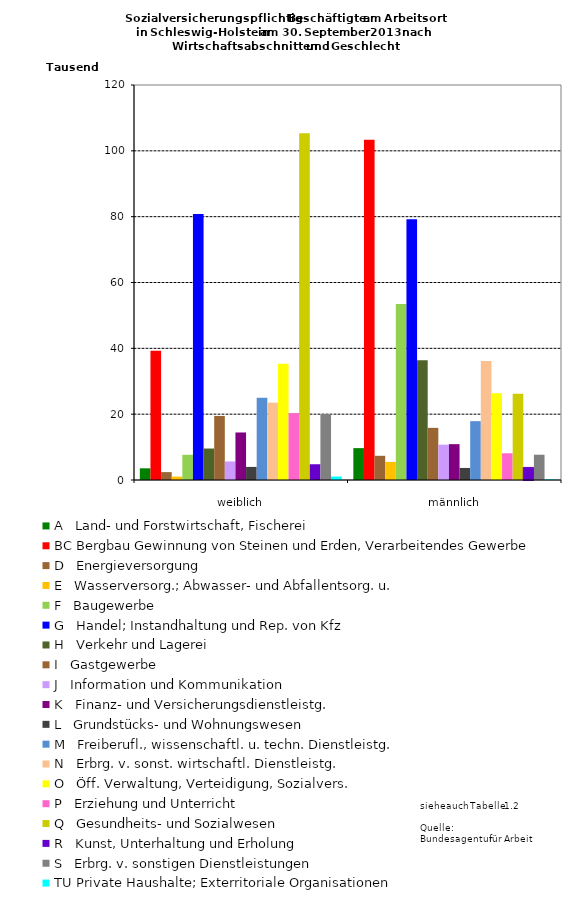
| Category | A   Land- und Forstwirtschaft, Fischerei | BC Bergbau Gewinnung von Steinen und Erden, Verarbeitendes Gewerbe | D   Energieversorgung | E   Wasserversorg.; Abwasser- und Abfallentsorg. u. | F   Baugewerbe | G   Handel; Instandhaltung und Rep. von Kfz | H   Verkehr und Lagerei | I   Gastgewerbe | J   Information und Kommunikation | K   Finanz- und Versicherungsdienstleistg. | L   Grundstücks- und Wohnungswesen | M   Freiberufl., wissenschaftl. u. techn. Dienstleistg. | N   Erbrg. v. sonst. wirtschaftl. Dienstleistg. | O   Öff. Verwaltung, Verteidigung, Sozialvers. | P   Erziehung und Unterricht | Q   Gesundheits- und Sozialwesen | R   Kunst, Unterhaltung und Erholung | S   Erbrg. v. sonstigen Dienstleistungen | TU Private Haushalte; Exterritoriale Organisationen |
|---|---|---|---|---|---|---|---|---|---|---|---|---|---|---|---|---|---|---|---|
| weiblich | 3550 | 39253 | 2395 | 1038 | 7664 | 80775 | 9560 | 19460 | 5640 | 14436 | 3978 | 24985 | 23507 | 35354 | 20299 | 105370 | 4787 | 20013 | 1061 |
| männlich | 9683 | 103370 | 7353 | 5499 | 53470 | 79188 | 36390 | 15846 | 10734 | 10893 | 3660 | 17877 | 36120 | 26356 | 8122 | 26194 | 3820 | 7679 | 213 |